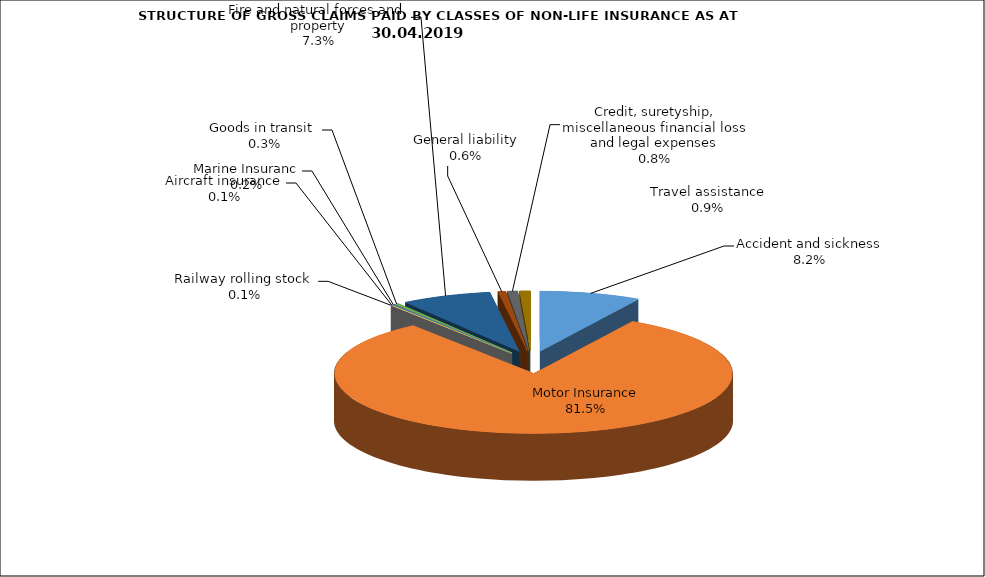
| Category | Accident and sickness | Series 1 |
|---|---|---|
| Accident and sickness | 0.082 | 0.085 |
| Motor Insurance | 0.815 | 0.849 |
| Railway rolling stock  | 0.001 | 0.001 |
| Aircraft insurance | 0.001 | 0 |
| Marine Insuranc | 0.002 | 0.001 |
| Goods in transit  | 0.003 | 0 |
| Fire and natural forces and property | 0.073 | 0.048 |
| General liability | 0.006 | 0.005 |
| Credit, suretyship, miscellaneous financial loss and legal expenses | 0.008 | 0.003 |
| Travel assistance | 0.009 | 0.007 |